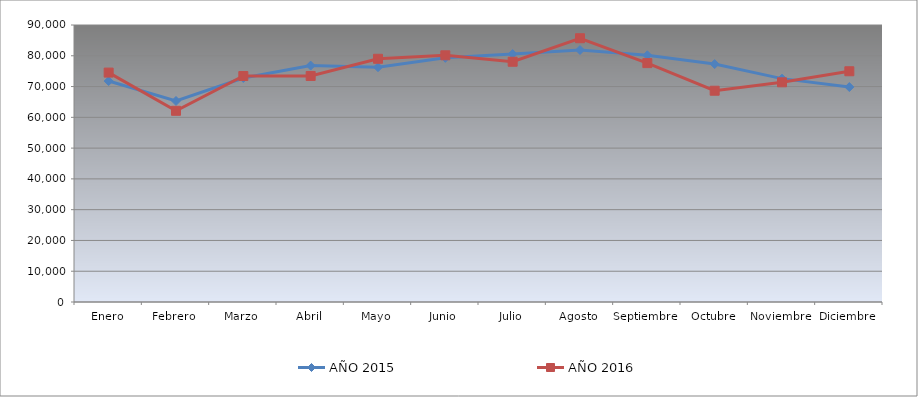
| Category | AÑO 2015 | AÑO 2016 |
|---|---|---|
| Enero | 71785.124 | 74539.278 |
| Febrero | 65307.502 | 62120.285 |
| Marzo | 72782.139 | 73423.628 |
| Abril | 76813.624 | 73442.194 |
| Mayo | 76289.148 | 79025.509 |
| Junio | 79327.023 | 80154.662 |
| Julio | 80553.071 | 78055.011 |
| Agosto | 81872.776 | 85700.844 |
| Septiembre | 80156.309 | 77622.929 |
| Octubre | 77302.341 | 68647.092 |
| Noviembre | 72570.987 | 71382.207 |
| Diciembre | 69837.069 | 74971.361 |